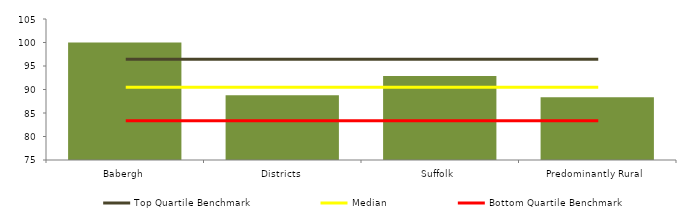
| Category | Block Data |
|---|---|
| Babergh | 100 |
| Districts | 88.769 |
| Suffolk | 92.889 |
|  Predominantly Rural   | 88.364 |